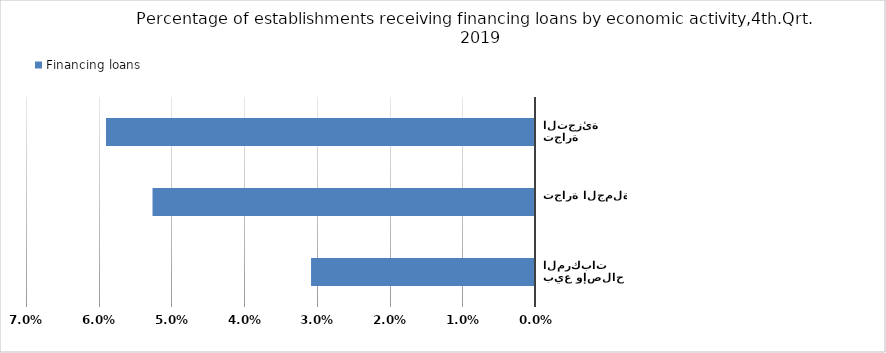
| Category | Financing loans |
|---|---|
| بيع وإصلاح المركبات  | 0.031 |
| تجارة الجملة | 0.053 |
| تجارة التجزئة | 0.059 |